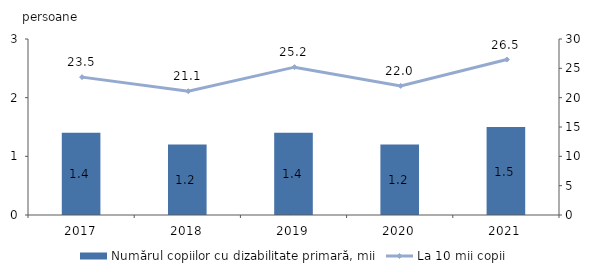
| Category | Numărul copiilor cu dizabilitate primară, mii |
|---|---|
| 2017.0 | 1.4 |
| 2018.0 | 1.2 |
| 2019.0 | 1.4 |
| 2020.0 | 1.2 |
| 2021.0 | 1.5 |